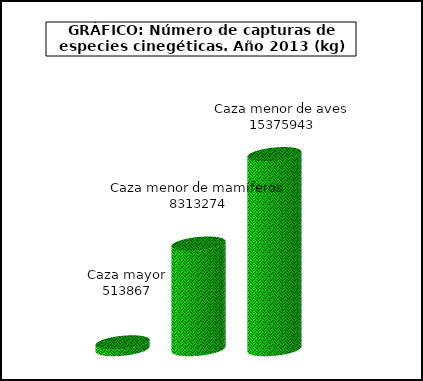
| Category | Cazar |
|---|---|
| Caza mayor | 513867 |
| Caza menor de mamíferos | 8313274 |
| Caza menor de aves | 15375943 |